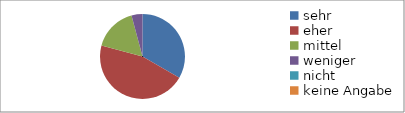
| Category | Series 0 |
|---|---|
| sehr | 8 |
| eher | 11 |
| mittel | 4 |
| weniger | 1 |
| nicht | 0 |
| keine Angabe | 0 |